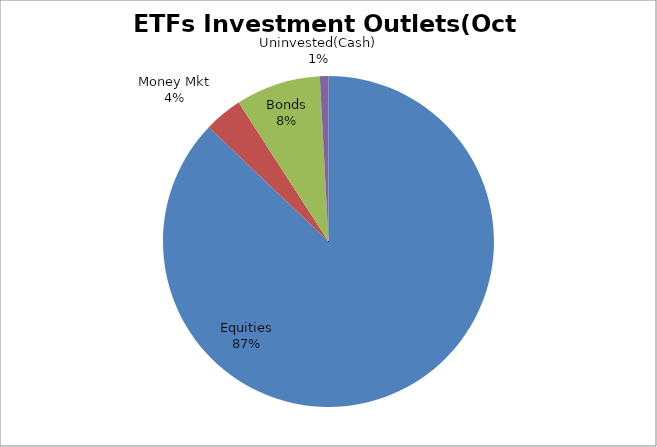
| Category | Series 0 |
|---|---|
| Equities | 4710183549.74 |
| Money Mkt | 201812628.7 |
| Bonds | 448435810.88 |
| Uninvested(Cash) | 45392103.41 |